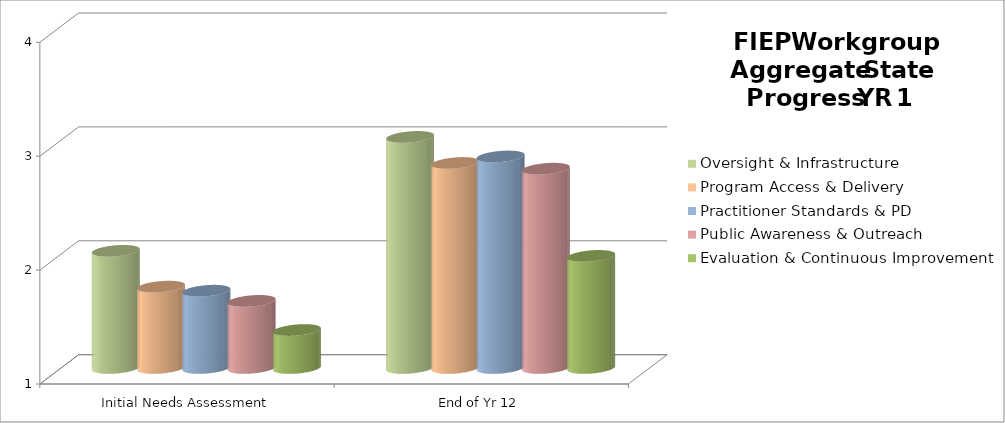
| Category | Oversight & Infrastructure | Program Access & Delivery | Practitioner Standards & PD | Public Awareness & Outreach | Evaluation & Continuous Improvement |
|---|---|---|---|---|---|
| Initial Needs Assessment | 2.029 | 1.714 | 1.679 | 1.589 | 1.333 |
| End of Yr 12 | 3.029 | 2.8 | 2.857 | 2.75 | 1.984 |